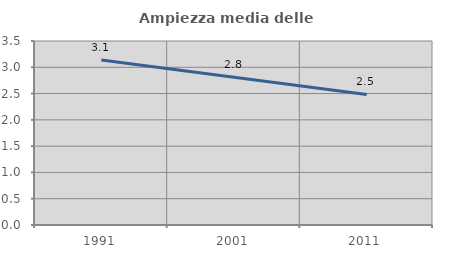
| Category | Ampiezza media delle famiglie |
|---|---|
| 1991.0 | 3.137 |
| 2001.0 | 2.809 |
| 2011.0 | 2.483 |